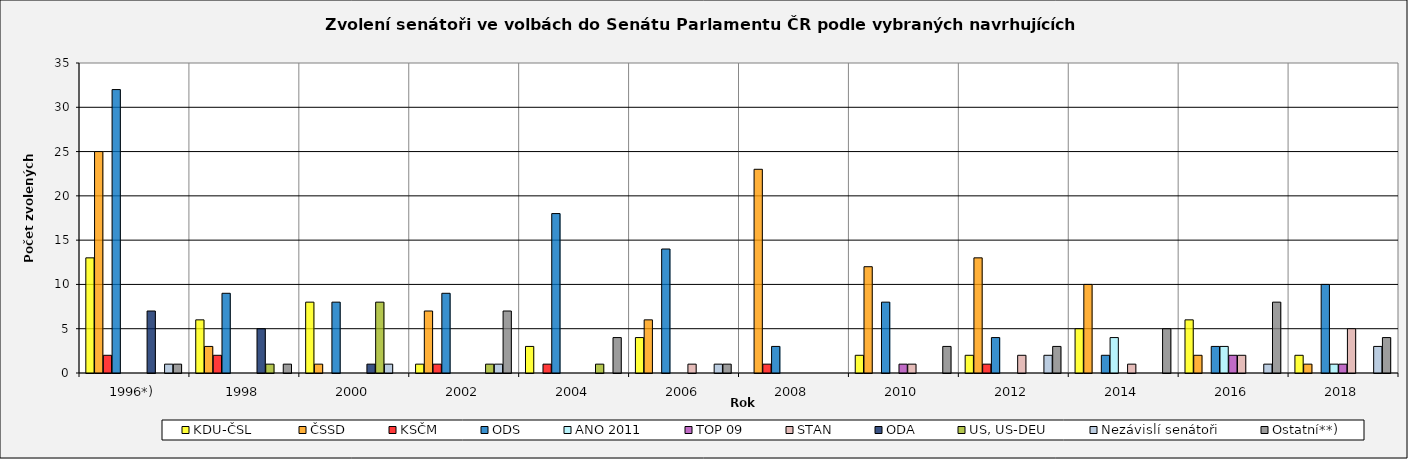
| Category | KDU-ČSL  | ČSSD | KSČM | ODS | ANO 2011 | TOP 09 | STAN | ODA | US, US-DEU | Nezávislí senátoři | Ostatní**) |
|---|---|---|---|---|---|---|---|---|---|---|---|
| 1996*) | 13 | 25 | 2 | 32 | 0 | 0 | 0 | 7 | 0 | 1 | 1 |
| 1998 | 6 | 3 | 2 | 9 | 0 | 0 | 0 | 5 | 1 | 0 | 1 |
| 2000 | 8 | 1 | 0 | 8 | 0 | 0 | 0 | 1 | 8 | 1 | 0 |
| 2002 | 1 | 7 | 1 | 9 | 0 | 0 | 0 | 0 | 1 | 1 | 7 |
| 2004 | 3 | 0 | 1 | 18 | 0 | 0 | 0 | 0 | 1 | 0 | 4 |
| 2006 | 4 | 6 | 0 | 14 | 0 | 0 | 1 | 0 | 0 | 1 | 1 |
| 2008 | 0 | 23 | 1 | 3 | 0 | 0 | 0 | 0 | 0 | 0 | 0 |
| 2010 | 2 | 12 | 0 | 8 | 0 | 1 | 1 | 0 | 0 | 0 | 3 |
| 2012 | 2 | 13 | 1 | 4 | 0 | 0 | 2 | 0 | 0 | 2 | 3 |
| 2014 | 5 | 10 | 0 | 2 | 4 | 0 | 1 | 0 | 0 | 0 | 5 |
| 2016 | 6 | 2 | 0 | 3 | 3 | 2 | 2 | 0 | 0 | 1 | 8 |
| 2018 | 2 | 1 | 0 | 10 | 1 | 1 | 5 | 0 | 0 | 3 | 4 |